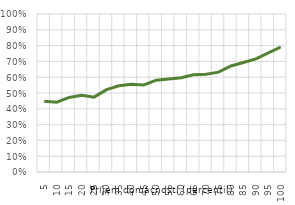
| Category | VS |
|---|---|
| 5.0 | 0.447 |
| 10.0 | 0.442 |
| 15.0 | 0.472 |
| 20.0 | 0.485 |
| 25.0 | 0.474 |
| 30.0 | 0.521 |
| 35.0 | 0.546 |
| 40.0 | 0.555 |
| 45.0 | 0.551 |
| 50.0 | 0.581 |
| 55.0 | 0.589 |
| 60.0 | 0.597 |
| 65.0 | 0.615 |
| 70.0 | 0.618 |
| 75.0 | 0.632 |
| 80.0 | 0.671 |
| 85.0 | 0.693 |
| 90.0 | 0.716 |
| 95.0 | 0.755 |
| 100.0 | 0.791 |